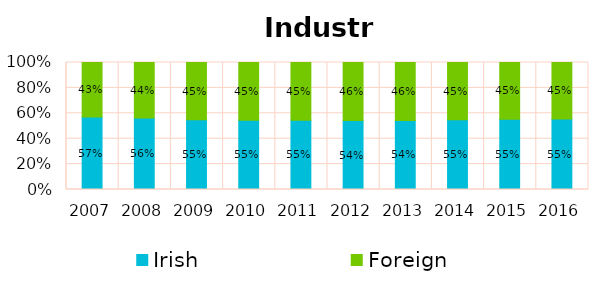
| Category | Irish | Foreign |
|---|---|---|
| 2007.0 | 0.57 | 0.43 |
| 2008.0 | 0.563 | 0.437 |
| 2009.0 | 0.549 | 0.451 |
| 2010.0 | 0.546 | 0.454 |
| 2011.0 | 0.545 | 0.455 |
| 2012.0 | 0.543 | 0.457 |
| 2013.0 | 0.544 | 0.456 |
| 2014.0 | 0.55 | 0.45 |
| 2015.0 | 0.553 | 0.447 |
| 2016.0 | 0.554 | 0.446 |